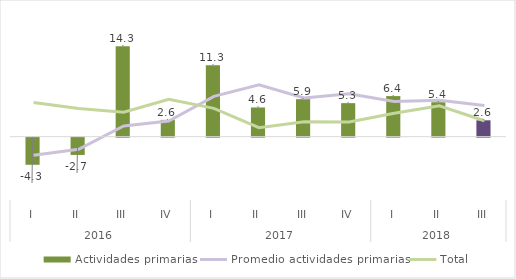
| Category | Actividades primarias |
|---|---|
| 0 | -4.282 |
| 1 | -2.728 |
| 2 | 14.275 |
| 3 | 2.649 |
| 4 | 11.284 |
| 5 | 4.61 |
| 6 | 5.923 |
| 7 | 5.293 |
| 8 | 6.408 |
| 9 | 5.439 |
| 10 | 2.581 |